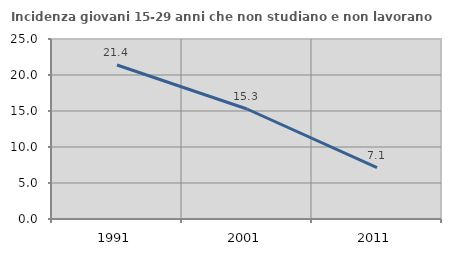
| Category | Incidenza giovani 15-29 anni che non studiano e non lavorano  |
|---|---|
| 1991.0 | 21.387 |
| 2001.0 | 15.278 |
| 2011.0 | 7.143 |